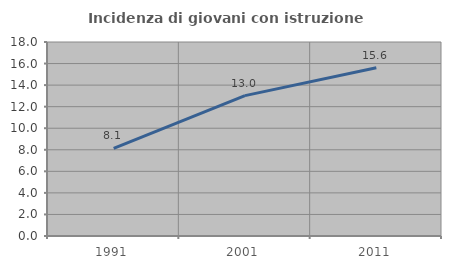
| Category | Incidenza di giovani con istruzione universitaria |
|---|---|
| 1991.0 | 8.14 |
| 2001.0 | 13.023 |
| 2011.0 | 15.603 |